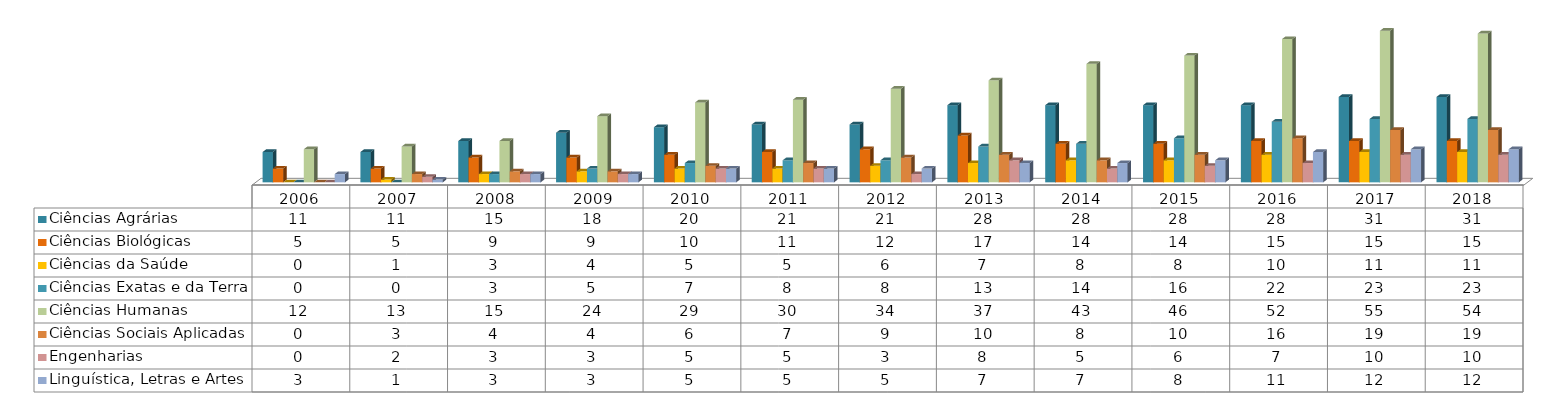
| Category | Ciências Agrárias  | Ciências Biológicas  | Ciências da Saúde  | Ciências Exatas e da Terra  | Ciências Humanas  | Ciências Sociais Aplicadas  | Engenharias  | Linguística, Letras e Artes  |
|---|---|---|---|---|---|---|---|---|
| 2006.0 | 11 | 5 | 0 | 0 | 12 | 0 | 0 | 3 |
| 2007.0 | 11 | 5 | 1 | 0 | 13 | 3 | 2 | 1 |
| 2008.0 | 15 | 9 | 3 | 3 | 15 | 4 | 3 | 3 |
| 2009.0 | 18 | 9 | 4 | 5 | 24 | 4 | 3 | 3 |
| 2010.0 | 20 | 10 | 5 | 7 | 29 | 6 | 5 | 5 |
| 2011.0 | 21 | 11 | 5 | 8 | 30 | 7 | 5 | 5 |
| 2012.0 | 21 | 12 | 6 | 8 | 34 | 9 | 3 | 5 |
| 2013.0 | 28 | 17 | 7 | 13 | 37 | 10 | 8 | 7 |
| 2014.0 | 28 | 14 | 8 | 14 | 43 | 8 | 5 | 7 |
| 2015.0 | 28 | 14 | 8 | 16 | 46 | 10 | 6 | 8 |
| 2016.0 | 28 | 15 | 10 | 22 | 52 | 16 | 7 | 11 |
| 2017.0 | 31 | 15 | 11 | 23 | 55 | 19 | 10 | 12 |
| 2018.0 | 31 | 15 | 11 | 23 | 54 | 19 | 10 | 12 |